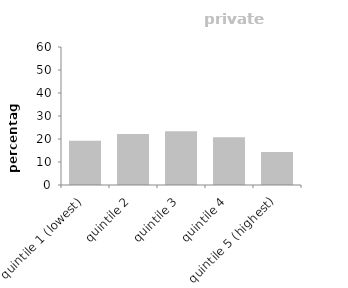
| Category | private renters |
|---|---|
| quintile 1 (lowest) | 19.212 |
| quintile 2 | 22.221 |
| quintile 3 | 23.391 |
| quintile 4 | 20.797 |
| quintile 5 (highest) | 14.379 |